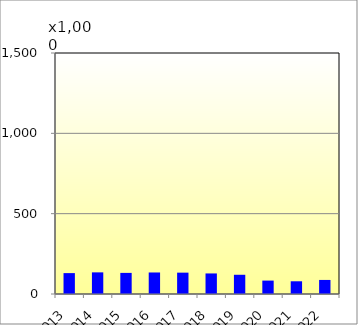
| Category | DOM | INT |
|---|---|---|
| 2013 | 130012 | 0 |
| 2014 | 134647 | 0 |
| 2015 | 131371 | 0 |
| 2016 | 133962 | 0 |
| 2017 | 132883 | 0 |
| 2018 | 127957 | 0 |
| 2019 | 119651 | 0 |
| 2020 | 83485 | 0 |
| 2021 | 79150 | 0 |
| 2022 | 87507 | 0 |